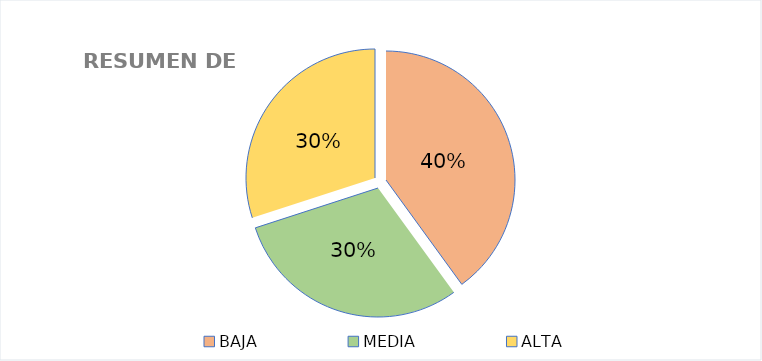
| Category | Series 0 |
|---|---|
| BAJA | 4 |
| MEDIA | 3 |
| ALTA | 3 |